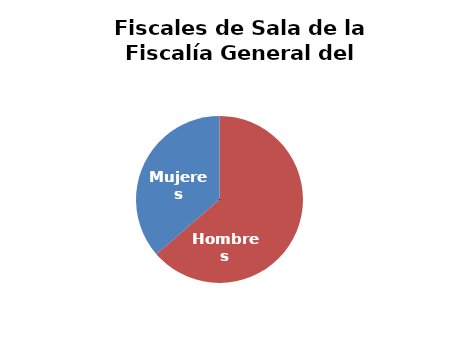
| Category | Fiscales de Sala de la Fiscalía General del Estado |
|---|---|
| Hombres | 7 |
| Mujeres | 4 |